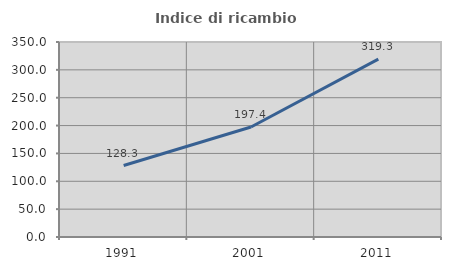
| Category | Indice di ricambio occupazionale  |
|---|---|
| 1991.0 | 128.302 |
| 2001.0 | 197.368 |
| 2011.0 | 319.298 |